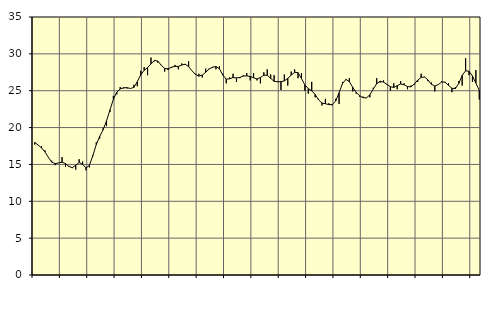
| Category | Piggar | Series 1 |
|---|---|---|
| nan | 17.7 | 17.99 |
| 87.0 | 17.6 | 17.63 |
| 87.0 | 17.5 | 17.23 |
| 87.0 | 16.9 | 16.69 |
| nan | 15.9 | 15.96 |
| 88.0 | 15.5 | 15.31 |
| 88.0 | 14.9 | 15.1 |
| 88.0 | 15.2 | 15.21 |
| nan | 16 | 15.3 |
| 89.0 | 14.7 | 15.12 |
| 89.0 | 14.8 | 14.72 |
| 89.0 | 14.5 | 14.57 |
| nan | 14.3 | 14.9 |
| 90.0 | 15.7 | 15.26 |
| 90.0 | 15.4 | 15.03 |
| 90.0 | 14.2 | 14.53 |
| nan | 14.6 | 14.87 |
| 91.0 | 16.1 | 16.2 |
| 91.0 | 18 | 17.69 |
| 91.0 | 18.5 | 18.8 |
| nan | 19.9 | 19.7 |
| 92.0 | 20.2 | 20.9 |
| 92.0 | 22.1 | 22.39 |
| 92.0 | 24.3 | 23.83 |
| nan | 24.5 | 24.81 |
| 93.0 | 25.5 | 25.24 |
| 93.0 | 25.3 | 25.41 |
| 93.0 | 25.3 | 25.41 |
| nan | 25.3 | 25.3 |
| 94.0 | 25.8 | 25.45 |
| 94.0 | 25.6 | 26.22 |
| 94.0 | 27.7 | 27.16 |
| nan | 28.2 | 27.76 |
| 95.0 | 27.1 | 28.14 |
| 95.0 | 29.5 | 28.64 |
| 95.0 | 29 | 29.11 |
| nan | 28.8 | 29.02 |
| 96.0 | 28.5 | 28.46 |
| 96.0 | 27.6 | 28.02 |
| 96.0 | 27.8 | 27.97 |
| nan | 28.1 | 28.18 |
| 97.0 | 28.5 | 28.3 |
| 97.0 | 27.9 | 28.3 |
| 97.0 | 28.7 | 28.48 |
| nan | 28.5 | 28.6 |
| 98.0 | 29 | 28.27 |
| 98.0 | 27.7 | 27.69 |
| 98.0 | 27.3 | 27.21 |
| nan | 27.3 | 26.98 |
| 99.0 | 26.8 | 27.12 |
| 99.0 | 28 | 27.5 |
| 99.0 | 28 | 27.94 |
| nan | 28.1 | 28.19 |
| 0.0 | 27.9 | 28.28 |
| 0.0 | 28.3 | 27.98 |
| 0.0 | 27.3 | 27.12 |
| nan | 26 | 26.56 |
| 1.0 | 26.8 | 26.62 |
| 1.0 | 27.3 | 26.79 |
| 1.0 | 26.2 | 26.74 |
| nan | 26.7 | 26.8 |
| 2.0 | 27.1 | 26.99 |
| 2.0 | 27.4 | 27.01 |
| 2.0 | 26.4 | 26.94 |
| nan | 27.4 | 26.76 |
| 3.0 | 26.4 | 26.59 |
| 3.0 | 26 | 26.79 |
| 3.0 | 27.5 | 27.1 |
| nan | 27.9 | 27.09 |
| 4.0 | 27.2 | 26.68 |
| 4.0 | 27.1 | 26.27 |
| 4.0 | 26.3 | 26.21 |
| nan | 25.1 | 26.24 |
| 5.0 | 27.2 | 26.33 |
| 5.0 | 25.7 | 26.68 |
| 5.0 | 27.6 | 27.11 |
| nan | 27.9 | 27.5 |
| 6.0 | 26.7 | 27.45 |
| 6.0 | 27.4 | 26.67 |
| 6.0 | 25 | 25.79 |
| nan | 24.6 | 25.28 |
| 7.0 | 26.2 | 24.99 |
| 7.0 | 24.1 | 24.5 |
| 7.0 | 23.9 | 23.75 |
| nan | 23 | 23.33 |
| 8.0 | 23.9 | 23.24 |
| 8.0 | 23.3 | 23.11 |
| 8.0 | 23 | 23.13 |
| nan | 23.9 | 23.59 |
| 9.0 | 23.2 | 24.72 |
| 9.0 | 26.2 | 25.97 |
| 9.0 | 26.6 | 26.53 |
| nan | 26.7 | 26.23 |
| 10.0 | 24.9 | 25.46 |
| 10.0 | 24.6 | 24.77 |
| 10.0 | 24.2 | 24.32 |
| nan | 24.2 | 24.05 |
| 11.0 | 24 | 24.03 |
| 11.0 | 24.1 | 24.44 |
| 11.0 | 25.4 | 25.22 |
| nan | 26.7 | 25.95 |
| 12.0 | 26.1 | 26.28 |
| 12.0 | 26.4 | 26.16 |
| 12.0 | 25.8 | 25.86 |
| nan | 25 | 25.55 |
| 13.0 | 26 | 25.44 |
| 13.0 | 25.2 | 25.69 |
| 13.0 | 26.3 | 25.91 |
| nan | 26 | 25.81 |
| 14.0 | 25.2 | 25.56 |
| 14.0 | 25.7 | 25.52 |
| 14.0 | 25.8 | 25.91 |
| nan | 26.2 | 26.44 |
| 15.0 | 27.3 | 26.81 |
| 15.0 | 26.9 | 26.85 |
| 15.0 | 26.3 | 26.45 |
| nan | 26.1 | 25.87 |
| 16.0 | 24.9 | 25.64 |
| 16.0 | 25.8 | 25.82 |
| 16.0 | 26.3 | 26.18 |
| nan | 26.2 | 26.16 |
| 17.0 | 26 | 25.72 |
| 17.0 | 24.8 | 25.33 |
| 17.0 | 25.5 | 25.29 |
| nan | 26.3 | 25.98 |
| 18.0 | 25.7 | 27.07 |
| 18.0 | 29.4 | 27.71 |
| 18.0 | 27.1 | 27.64 |
| nan | 26.2 | 27 |
| 19.0 | 27.8 | 26.02 |
| 19.0 | 23.8 | 25.05 |